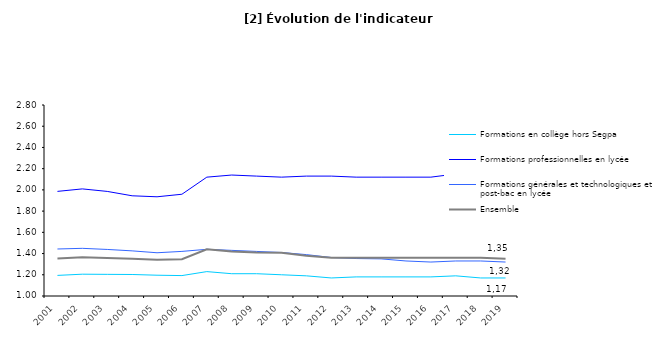
| Category | Formations en collège hors Segpa | Formations professionnelles en lycée | Formations générales et technologiques et post-bac en lycée | Ensemble |
|---|---|---|---|---|
| 2001.0 | 1.194 | 1.986 | 1.443 | 1.353 |
| 2002.0 | 1.206 | 2.009 | 1.449 | 1.364 |
| 2003.0 | 1.204 | 1.986 | 1.439 | 1.358 |
| 2004.0 | 1.203 | 1.944 | 1.425 | 1.351 |
| 2005.0 | 1.196 | 1.935 | 1.407 | 1.341 |
| 2006.0 | 1.192 | 1.959 | 1.42 | 1.346 |
| 2007.0 | 1.23 | 2.12 | 1.44 | 1.44 |
| 2008.0 | 1.21 | 2.14 | 1.43 | 1.42 |
| 2009.0 | 1.21 | 2.13 | 1.42 | 1.41 |
| 2010.0 | 1.2 | 2.12 | 1.41 | 1.407 |
| 2011.0 | 1.19 | 2.13 | 1.39 | 1.38 |
| 2012.0 | 1.17 | 2.13 | 1.363 | 1.36 |
| 2013.0 | 1.18 | 2.12 | 1.353 | 1.36 |
| 2014.0 | 1.18 | 2.12 | 1.35 | 1.36 |
| 2015.0 | 1.18 | 2.12 | 1.33 | 1.36 |
| 2016.0 | 1.18 | 2.12 | 1.32 | 1.36 |
| 2017.0 | 1.19 | 2.15 | 1.33 | 1.36 |
| 2018.0 | 1.17 | 2.16 | 1.33 | 1.36 |
| 2019.0 | 1.17 | 2.19 | 1.32 | 1.35 |